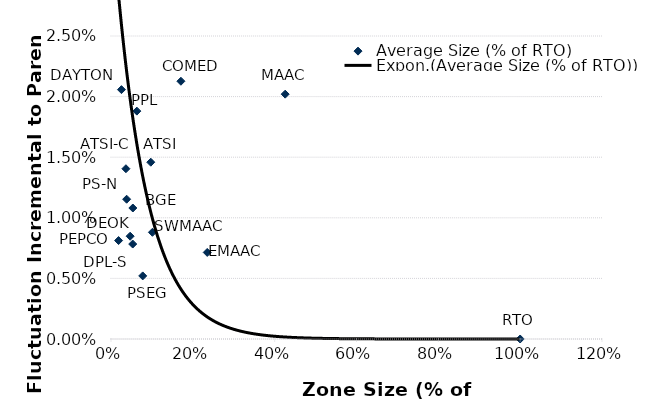
| Category | Average Size (% of RTO) |
|---|---|
| 1.0 | 0 |
| 0.42573314680111113 | 0.02 |
| 0.2352298959989495 | 0.007 |
| 0.10127193402245102 | 0.009 |
| 0.07754289552169358 | 0.005 |
| 0.0382280298917613 | 0.012 |
| 0.018525778677153132 | 0.008 |
| 0.053077662577667856 | 0.008 |
| 0.09721508962727589 | 0.015 |
| 0.036501522362990674 | 0.014 |
| 0.1708718205143358 | 0.021 |
| 0.0533832446091003 | 0.011 |
| 0.06317570220669841 | 0.019 |
| 0.025530322934722037 | 0.021 |
| 0.046809302897469804 | 0.008 |